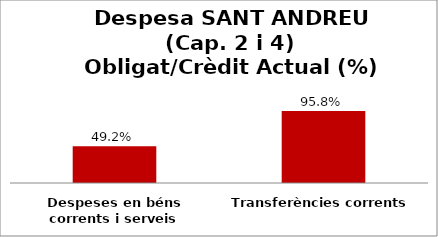
| Category | Series 0 |
|---|---|
| Despeses en béns corrents i serveis | 0.492 |
| Transferències corrents | 0.958 |